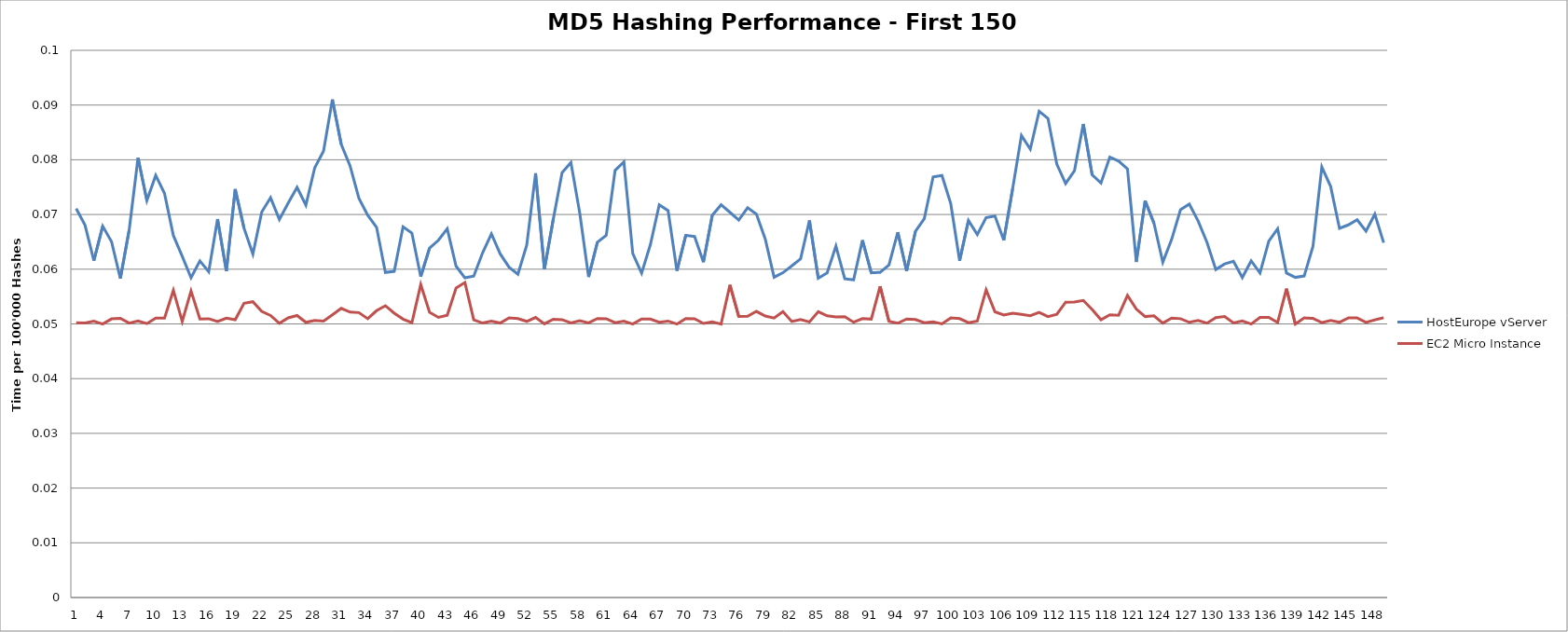
| Category | HostEurope vServer | EC2 Micro Instance |
|---|---|---|
| 0 | 0.071 | 0.05 |
| 1 | 0.068 | 0.05 |
| 2 | 0.062 | 0.05 |
| 3 | 0.068 | 0.05 |
| 4 | 0.065 | 0.051 |
| 5 | 0.058 | 0.051 |
| 6 | 0.067 | 0.05 |
| 7 | 0.08 | 0.051 |
| 8 | 0.073 | 0.05 |
| 9 | 0.077 | 0.051 |
| 10 | 0.074 | 0.051 |
| 11 | 0.066 | 0.056 |
| 12 | 0.062 | 0.05 |
| 13 | 0.058 | 0.056 |
| 14 | 0.062 | 0.051 |
| 15 | 0.06 | 0.051 |
| 16 | 0.069 | 0.05 |
| 17 | 0.06 | 0.051 |
| 18 | 0.075 | 0.051 |
| 19 | 0.067 | 0.054 |
| 20 | 0.063 | 0.054 |
| 21 | 0.07 | 0.052 |
| 22 | 0.073 | 0.052 |
| 23 | 0.069 | 0.05 |
| 24 | 0.072 | 0.051 |
| 25 | 0.075 | 0.052 |
| 26 | 0.072 | 0.05 |
| 27 | 0.079 | 0.051 |
| 28 | 0.082 | 0.051 |
| 29 | 0.091 | 0.052 |
| 30 | 0.083 | 0.053 |
| 31 | 0.079 | 0.052 |
| 32 | 0.073 | 0.052 |
| 33 | 0.07 | 0.051 |
| 34 | 0.068 | 0.052 |
| 35 | 0.059 | 0.053 |
| 36 | 0.06 | 0.052 |
| 37 | 0.068 | 0.051 |
| 38 | 0.067 | 0.05 |
| 39 | 0.059 | 0.057 |
| 40 | 0.064 | 0.052 |
| 41 | 0.065 | 0.051 |
| 42 | 0.067 | 0.052 |
| 43 | 0.061 | 0.057 |
| 44 | 0.058 | 0.058 |
| 45 | 0.059 | 0.051 |
| 46 | 0.063 | 0.05 |
| 47 | 0.066 | 0.05 |
| 48 | 0.063 | 0.05 |
| 49 | 0.06 | 0.051 |
| 50 | 0.059 | 0.051 |
| 51 | 0.064 | 0.05 |
| 52 | 0.078 | 0.051 |
| 53 | 0.06 | 0.05 |
| 54 | 0.069 | 0.051 |
| 55 | 0.078 | 0.051 |
| 56 | 0.08 | 0.05 |
| 57 | 0.07 | 0.051 |
| 58 | 0.059 | 0.05 |
| 59 | 0.065 | 0.051 |
| 60 | 0.066 | 0.051 |
| 61 | 0.078 | 0.05 |
| 62 | 0.08 | 0.051 |
| 63 | 0.063 | 0.05 |
| 64 | 0.059 | 0.051 |
| 65 | 0.065 | 0.051 |
| 66 | 0.072 | 0.05 |
| 67 | 0.071 | 0.051 |
| 68 | 0.06 | 0.05 |
| 69 | 0.066 | 0.051 |
| 70 | 0.066 | 0.051 |
| 71 | 0.061 | 0.05 |
| 72 | 0.07 | 0.05 |
| 73 | 0.072 | 0.05 |
| 74 | 0.07 | 0.057 |
| 75 | 0.069 | 0.051 |
| 76 | 0.071 | 0.051 |
| 77 | 0.07 | 0.052 |
| 78 | 0.066 | 0.051 |
| 79 | 0.059 | 0.051 |
| 80 | 0.059 | 0.052 |
| 81 | 0.061 | 0.05 |
| 82 | 0.062 | 0.051 |
| 83 | 0.069 | 0.05 |
| 84 | 0.058 | 0.052 |
| 85 | 0.059 | 0.051 |
| 86 | 0.064 | 0.051 |
| 87 | 0.058 | 0.051 |
| 88 | 0.058 | 0.05 |
| 89 | 0.065 | 0.051 |
| 90 | 0.059 | 0.051 |
| 91 | 0.059 | 0.057 |
| 92 | 0.061 | 0.05 |
| 93 | 0.067 | 0.05 |
| 94 | 0.06 | 0.051 |
| 95 | 0.067 | 0.051 |
| 96 | 0.069 | 0.05 |
| 97 | 0.077 | 0.05 |
| 98 | 0.077 | 0.05 |
| 99 | 0.072 | 0.051 |
| 100 | 0.062 | 0.051 |
| 101 | 0.069 | 0.05 |
| 102 | 0.066 | 0.051 |
| 103 | 0.069 | 0.056 |
| 104 | 0.07 | 0.052 |
| 105 | 0.065 | 0.052 |
| 106 | 0.075 | 0.052 |
| 107 | 0.084 | 0.052 |
| 108 | 0.082 | 0.051 |
| 109 | 0.089 | 0.052 |
| 110 | 0.088 | 0.051 |
| 111 | 0.079 | 0.052 |
| 112 | 0.076 | 0.054 |
| 113 | 0.078 | 0.054 |
| 114 | 0.087 | 0.054 |
| 115 | 0.077 | 0.053 |
| 116 | 0.076 | 0.051 |
| 117 | 0.081 | 0.052 |
| 118 | 0.08 | 0.052 |
| 119 | 0.078 | 0.055 |
| 120 | 0.061 | 0.053 |
| 121 | 0.073 | 0.051 |
| 122 | 0.068 | 0.051 |
| 123 | 0.061 | 0.05 |
| 124 | 0.065 | 0.051 |
| 125 | 0.071 | 0.051 |
| 126 | 0.072 | 0.05 |
| 127 | 0.069 | 0.051 |
| 128 | 0.065 | 0.05 |
| 129 | 0.06 | 0.051 |
| 130 | 0.061 | 0.051 |
| 131 | 0.061 | 0.05 |
| 132 | 0.058 | 0.051 |
| 133 | 0.062 | 0.05 |
| 134 | 0.059 | 0.051 |
| 135 | 0.065 | 0.051 |
| 136 | 0.067 | 0.05 |
| 137 | 0.059 | 0.056 |
| 138 | 0.059 | 0.05 |
| 139 | 0.059 | 0.051 |
| 140 | 0.064 | 0.051 |
| 141 | 0.079 | 0.05 |
| 142 | 0.075 | 0.051 |
| 143 | 0.067 | 0.05 |
| 144 | 0.068 | 0.051 |
| 145 | 0.069 | 0.051 |
| 146 | 0.067 | 0.05 |
| 147 | 0.07 | 0.051 |
| 148 | 0.065 | 0.051 |